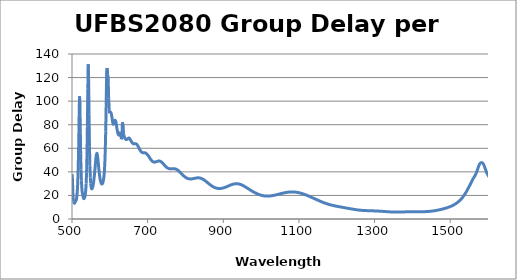
| Category | Group Delay (fs) |
|---|---|
| 500.5810987 | 37.939 |
| 501.5115468 | 30.313 |
| 502.4454603 | 21.085 |
| 503.3828586 | 16.11 |
| 504.3237611 | 15.022 |
| 505.2681876 | 14.304 |
| 506.216158 | 13.361 |
| 507.1676921 | 13.567 |
| 508.1228102 | 14.343 |
| 509.0815325 | 15.039 |
| 510.0438794 | 15.508 |
| 511.0098716 | 15.865 |
| 511.9795298 | 17.02 |
| 512.9528749 | 19.517 |
| 513.929928 | 23.345 |
| 514.9107103 | 29.072 |
| 515.8952432 | 37.767 |
| 516.8835483 | 50.005 |
| 517.8756472 | 66.155 |
| 518.8715619 | 87.667 |
| 519.8713145 | 104.182 |
| 520.874927 | 99.35 |
| 521.8824221 | 77.248 |
| 522.8938221 | 55.877 |
| 523.9091499 | 42.122 |
| 524.9284284 | 32.774 |
| 525.9516807 | 26.502 |
| 526.9789301 | 22.778 |
| 528.0102 | 21.077 |
| 529.0455141 | 19.631 |
| 530.0848963 | 17.989 |
| 531.1283705 | 17.291 |
| 532.175961 | 17.576 |
| 533.2276921 | 18.204 |
| 534.2835885 | 19.234 |
| 535.343675 | 21.33 |
| 536.4079765 | 24.619 |
| 537.4765183 | 30.146 |
| 538.5493258 | 39.652 |
| 539.6264244 | 55.221 |
| 540.7078401 | 78.685 |
| 541.7935988 | 110.632 |
| 542.8837268 | 131.229 |
| 543.9782504 | 119.115 |
| 545.0771964 | 88.375 |
| 546.1805915 | 61.818 |
| 547.2884629 | 45.165 |
| 548.4008378 | 35.362 |
| 549.5177438 | 29.897 |
| 550.6392086 | 27.032 |
| 551.7652601 | 25.695 |
| 552.8959266 | 25.607 |
| 554.0312366 | 26.475 |
| 555.1712185 | 27.742 |
| 556.3159014 | 29.549 |
| 557.4653145 | 32.128 |
| 558.619487 | 35.254 |
| 559.7784486 | 38.896 |
| 560.9422291 | 43.206 |
| 562.1108588 | 47.703 |
| 563.2843679 | 51.611 |
| 564.462787 | 54.493 |
| 565.6461472 | 55.712 |
| 566.8344794 | 54.731 |
| 568.0278152 | 52.026 |
| 569.2261861 | 48.337 |
| 570.4296241 | 44.286 |
| 571.6381614 | 40.485 |
| 572.8518306 | 37.147 |
| 574.0706643 | 34.445 |
| 575.2946955 | 32.458 |
| 576.5239577 | 31.016 |
| 577.7584844 | 30.071 |
| 578.9983094 | 29.672 |
| 580.2434671 | 29.917 |
| 581.4939918 | 30.805 |
| 582.7499184 | 32.353 |
| 584.0112818 | 34.866 |
| 585.2781176 | 39.035 |
| 586.5504613 | 45.696 |
| 587.828349 | 56.761 |
| 589.111817 | 74.076 |
| 590.400902 | 97.606 |
| 591.6956408 | 126.684 |
| 592.9960708 | 128.081 |
| 594.3022295 | 122.493 |
| 595.614155 | 119.985 |
| 596.9318854 | 102.425 |
| 598.2554594 | 93.176 |
| 599.584916 | 89.641 |
| 600.9202944 | 89.967 |
| 602.2616344 | 90.622 |
| 603.6089758 | 89.657 |
| 604.9623592 | 87.546 |
| 606.3218252 | 84.653 |
| 607.6874149 | 81.897 |
| 609.0591698 | 80.448 |
| 610.4371317 | 80.867 |
| 611.8213429 | 82.52 |
| 613.2118459 | 83.639 |
| 614.6086838 | 83.621 |
| 616.0119 | 82.446 |
| 617.4215382 | 79.79 |
| 618.8376427 | 76.657 |
| 620.2602579 | 74.068 |
| 621.689429 | 72.283 |
| 623.1252014 | 71.397 |
| 624.5676208 | 71.155 |
| 626.0167336 | 71.805 |
| 627.4725865 | 73.234 |
| 628.9352266 | 73.628 |
| 630.4047014 | 67.647 |
| 631.881059 | 69.017 |
| 633.3643479 | 82.065 |
| 634.8546169 | 80.537 |
| 636.3519156 | 72.283 |
| 637.8562936 | 70.454 |
| 639.3678014 | 68.849 |
| 640.8864898 | 68.029 |
| 642.41241 | 67.525 |
| 643.9456138 | 67.443 |
| 645.4861536 | 67.627 |
| 647.034082 | 68.036 |
| 648.5894524 | 68.426 |
| 650.1523186 | 68.679 |
| 651.7227348 | 68.561 |
| 653.3007559 | 67.79 |
| 654.8864374 | 66.872 |
| 656.479835 | 66.084 |
| 658.0810054 | 65.236 |
| 659.6900054 | 64.506 |
| 661.3068927 | 64.015 |
| 662.9317253 | 63.752 |
| 664.5645621 | 63.753 |
| 666.2054622 | 63.818 |
| 667.8544856 | 63.834 |
| 669.5116928 | 63.733 |
| 671.1771448 | 63.368 |
| 672.8509032 | 62.727 |
| 674.5330305 | 61.791 |
| 676.2235895 | 60.739 |
| 677.9226437 | 59.683 |
| 679.6302574 | 58.621 |
| 681.3464955 | 57.756 |
| 683.0714233 | 57.105 |
| 684.8051071 | 56.609 |
| 686.5476137 | 56.31 |
| 688.2990107 | 56.196 |
| 690.0593662 | 56.199 |
| 691.8287492 | 56.178 |
| 693.6072293 | 56.036 |
| 695.3948768 | 55.78 |
| 697.1917628 | 55.375 |
| 698.9979591 | 54.794 |
| 700.8135382 | 54.099 |
| 702.6385734 | 53.305 |
| 704.4731389 | 52.38 |
| 706.3173094 | 51.408 |
| 708.1711606 | 50.527 |
| 710.034769 | 49.771 |
| 711.9082116 | 49.139 |
| 713.7915667 | 48.662 |
| 715.684913 | 48.355 |
| 717.5883303 | 48.231 |
| 719.5018992 | 48.311 |
| 721.4257011 | 48.502 |
| 723.3598182 | 48.673 |
| 725.3043339 | 48.871 |
| 727.2593321 | 49.083 |
| 729.2248978 | 49.19 |
| 731.2011171 | 49.172 |
| 733.1880766 | 49.011 |
| 735.1858643 | 48.674 |
| 737.1945689 | 48.175 |
| 739.21428 | 47.548 |
| 741.2450885 | 46.842 |
| 743.287086 | 46.099 |
| 745.3403652 | 45.358 |
| 747.4050199 | 44.658 |
| 749.481145 | 44.038 |
| 751.5688362 | 43.51 |
| 753.6681905 | 43.081 |
| 755.7793059 | 42.799 |
| 757.9022815 | 42.666 |
| 760.0372175 | 42.613 |
| 762.1842153 | 42.604 |
| 764.3433773 | 42.636 |
| 766.5148074 | 42.679 |
| 768.6986103 | 42.689 |
| 770.894892 | 42.637 |
| 773.1037599 | 42.494 |
| 775.3253224 | 42.242 |
| 777.5596893 | 41.873 |
| 779.8069717 | 41.389 |
| 782.0672817 | 40.796 |
| 784.3407331 | 40.125 |
| 786.6274408 | 39.402 |
| 788.9275211 | 38.645 |
| 791.2410915 | 37.885 |
| 793.5682712 | 37.144 |
| 795.9091805 | 36.444 |
| 798.2639414 | 35.816 |
| 800.6326772 | 35.277 |
| 803.0155125 | 34.828 |
| 805.4125737 | 34.473 |
| 807.8239886 | 34.215 |
| 810.2498865 | 34.058 |
| 812.6903982 | 34.002 |
| 815.1456562 | 34.019 |
| 817.6157946 | 34.089 |
| 820.1009489 | 34.223 |
| 822.6012567 | 34.394 |
| 825.1168569 | 34.57 |
| 827.6478902 | 34.733 |
| 830.1944991 | 34.854 |
| 832.7568278 | 34.922 |
| 835.3350223 | 34.916 |
| 837.9292304 | 34.801 |
| 840.5396019 | 34.575 |
| 843.1662881 | 34.246 |
| 845.8094426 | 33.819 |
| 848.4692208 | 33.302 |
| 851.1457798 | 32.702 |
| 853.8392791 | 32.042 |
| 856.54988 | 31.337 |
| 859.2777459 | 30.611 |
| 862.0230422 | 29.891 |
| 864.7859365 | 29.185 |
| 867.5665987 | 28.518 |
| 870.3652007 | 27.91 |
| 873.1819165 | 27.357 |
| 876.0169227 | 26.88 |
| 878.8703981 | 26.501 |
| 881.7425235 | 26.217 |
| 884.6334826 | 26.017 |
| 887.5434612 | 25.898 |
| 890.4726475 | 25.877 |
| 893.4212325 | 25.949 |
| 896.3894093 | 26.096 |
| 899.377374 | 26.316 |
| 902.3853251 | 26.6 |
| 905.4134638 | 26.941 |
| 908.4619939 | 27.323 |
| 911.5311223 | 27.734 |
| 914.6210583 | 28.163 |
| 917.7320143 | 28.588 |
| 920.8642055 | 28.989 |
| 924.01785 | 29.343 |
| 927.1931691 | 29.624 |
| 930.3903869 | 29.831 |
| 933.6097308 | 29.943 |
| 936.8514313 | 29.929 |
| 940.115722 | 29.794 |
| 943.4028399 | 29.552 |
| 946.7130253 | 29.192 |
| 950.0465218 | 28.722 |
| 953.4035767 | 28.167 |
| 956.7844404 | 27.549 |
| 960.1893673 | 26.881 |
| 963.618615 | 26.178 |
| 967.0724452 | 25.464 |
| 970.551123 | 24.761 |
| 974.0549177 | 24.062 |
| 977.5841022 | 23.367 |
| 981.1389535 | 22.724 |
| 984.7197526 | 22.147 |
| 988.3267846 | 21.605 |
| 991.960339 | 21.1 |
| 995.6207092 | 20.648 |
| 999.3081933 | 20.256 |
| 1003.023094 | 19.934 |
| 1006.765717 | 19.694 |
| 1010.536375 | 19.542 |
| 1014.335384 | 19.462 |
| 1018.163065 | 19.452 |
| 1022.019743 | 19.511 |
| 1025.90575 | 19.636 |
| 1029.821421 | 19.832 |
| 1033.767097 | 20.081 |
| 1037.743124 | 20.351 |
| 1041.749854 | 20.659 |
| 1045.787644 | 20.997 |
| 1049.856857 | 21.337 |
| 1053.95786 | 21.674 |
| 1058.091028 | 21.986 |
| 1062.256741 | 22.262 |
| 1066.455384 | 22.515 |
| 1070.68735 | 22.725 |
| 1074.953037 | 22.873 |
| 1079.252849 | 22.956 |
| 1083.587198 | 22.971 |
| 1087.956501 | 22.901 |
| 1092.361183 | 22.743 |
| 1096.801676 | 22.511 |
| 1101.278417 | 22.198 |
| 1105.791853 | 21.81 |
| 1110.342437 | 21.359 |
| 1114.930629 | 20.85 |
| 1119.556897 | 20.294 |
| 1124.221718 | 19.675 |
| 1128.925574 | 19.014 |
| 1133.668959 | 18.343 |
| 1138.452372 | 17.643 |
| 1143.276323 | 16.946 |
| 1148.141329 | 16.252 |
| 1153.047915 | 15.533 |
| 1157.996619 | 14.838 |
| 1162.987984 | 14.19 |
| 1168.022564 | 13.577 |
| 1173.100923 | 12.997 |
| 1178.223634 | 12.474 |
| 1183.391282 | 12.011 |
| 1188.604459 | 11.592 |
| 1193.863771 | 11.208 |
| 1199.169832 | 10.855 |
| 1204.523269 | 10.529 |
| 1209.924718 | 10.214 |
| 1215.37483 | 9.902 |
| 1220.874263 | 9.586 |
| 1226.423692 | 9.264 |
| 1232.0238 | 8.939 |
| 1237.675285 | 8.611 |
| 1243.378858 | 8.289 |
| 1249.135242 | 7.99 |
| 1254.945173 | 7.726 |
| 1260.809403 | 7.5 |
| 1266.728696 | 7.326 |
| 1272.703831 | 7.202 |
| 1278.735603 | 7.112 |
| 1284.82482 | 7.048 |
| 1290.972307 | 6.983 |
| 1297.178905 | 6.907 |
| 1303.44547 | 6.821 |
| 1309.772875 | 6.715 |
| 1316.162011 | 6.586 |
| 1322.613785 | 6.446 |
| 1329.129124 | 6.297 |
| 1335.708971 | 6.152 |
| 1342.35429 | 6.03 |
| 1349.066061 | 5.941 |
| 1355.845287 | 5.909 |
| 1362.692991 | 5.932 |
| 1369.610214 | 5.952 |
| 1376.598021 | 5.997 |
| 1383.657498 | 6.083 |
| 1390.789754 | 6.131 |
| 1397.995918 | 6.152 |
| 1405.277147 | 6.161 |
| 1412.634619 | 6.147 |
| 1420.069538 | 6.148 |
| 1427.583133 | 6.18 |
| 1435.176661 | 6.264 |
| 1442.851402 | 6.424 |
| 1450.608668 | 6.665 |
| 1458.449796 | 7.003 |
| 1466.376153 | 7.451 |
| 1474.389138 | 8.001 |
| 1482.490177 | 8.656 |
| 1490.68073 | 9.435 |
| 1498.96229 | 10.387 |
| 1507.336381 | 11.602 |
| 1515.804563 | 13.206 |
| 1524.368431 | 15.389 |
| 1533.029615 | 18.422 |
| 1541.789784 | 22.591 |
| 1550.650645 | 27.904 |
| 1559.613943 | 33.569 |
| 1568.681466 | 38.705 |
| 1577.855042 | 46.654 |
| 1587.136542 | 47.054 |
| 1596.527883 | 39.314 |
| 1606.031025 | 34.031 |